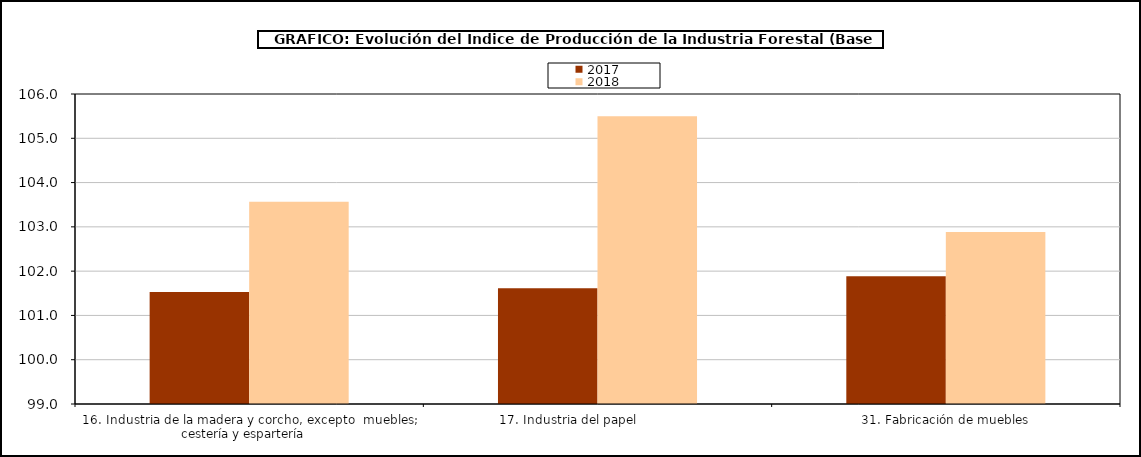
| Category | 2017 | 2018 |
|---|---|---|
| 16. Industria de la madera y corcho, excepto  muebles; cestería y espartería    | 101.53 | 103.567 |
| 17. Industria del papel                | 101.611 | 105.498 |
| 31. Fabricación de muebles | 101.884 | 102.886 |